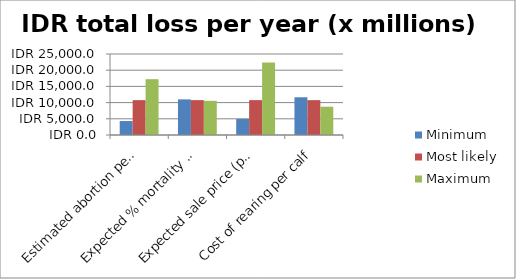
| Category | Minimum | Most likely | Maximum |
|---|---|---|---|
| Estimated abortion percentage | 4306.8 | 10767 | 17227.2 |
| Expected % mortality before sale | 10989 | 10767 | 10545 |
| Expected sale price (per calf) | 4947 | 10767 | 22407 |
| Cost of rearing per calf | 11640 | 10767 | 8730 |